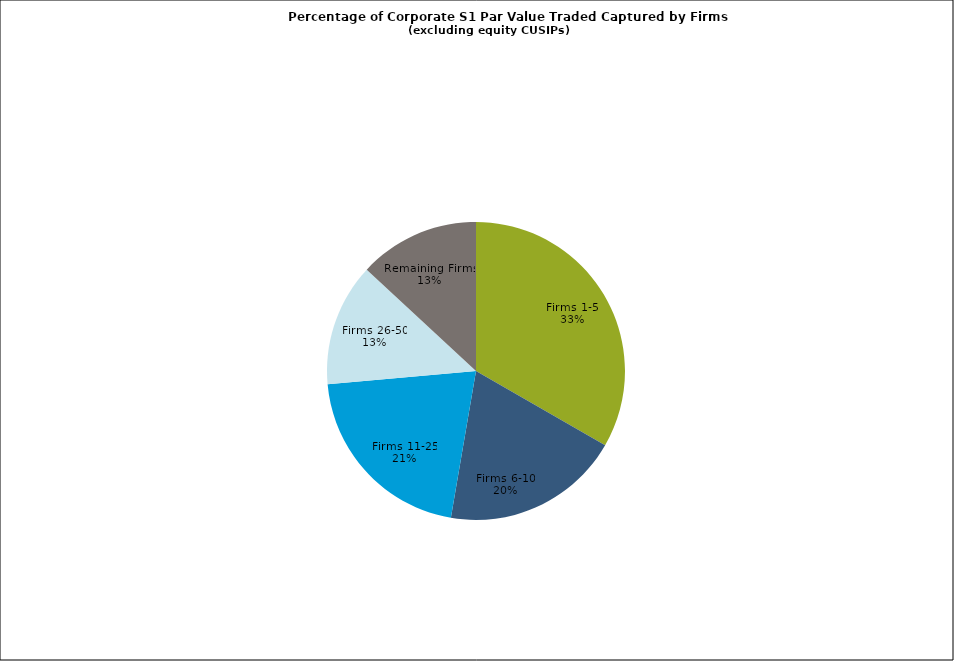
| Category | Series 0 |
|---|---|
| Firms 1-5 | 0.333 |
| Firms 6-10 | 0.194 |
| Firms 11-25 | 0.209 |
| Firms 26-50 | 0.133 |
| Remaining Firms | 0.131 |